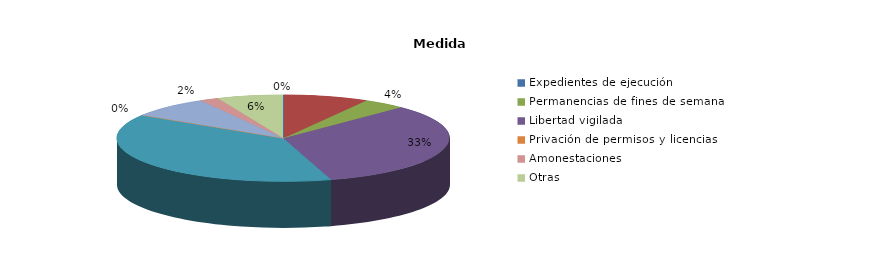
| Category | Series 0 |
|---|---|
| Expedientes de ejecución | 0 |
| Internamientos | 18 |
| Permanencias de fines de semana | 9 |
| Libertad vigilada | 72 |
| Prestaciones en beneficio de la comunidad | 84 |
| Privación de permisos y licencias | 0 |
| Convivencia Familiar Educativa | 17 |
| Amonestaciones | 4 |
| Otras | 14 |